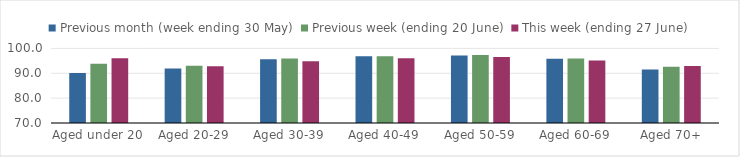
| Category | Previous month (week ending 30 May) | Previous week (ending 20 June) | This week (ending 27 June) |
|---|---|---|---|
| Aged under 20 | 90.106 | 93.872 | 96.008 |
| Aged 20-29 | 91.974 | 93.064 | 92.871 |
| Aged 30-39 | 95.675 | 95.905 | 94.857 |
| Aged 40-49 | 96.889 | 96.842 | 96.06 |
| Aged 50-59 | 97.19 | 97.327 | 96.544 |
| Aged 60-69 | 95.798 | 95.958 | 95.139 |
| Aged 70+ | 91.491 | 92.639 | 92.911 |